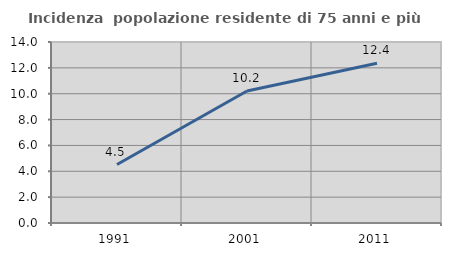
| Category | Incidenza  popolazione residente di 75 anni e più |
|---|---|
| 1991.0 | 4.52 |
| 2001.0 | 10.21 |
| 2011.0 | 12.353 |